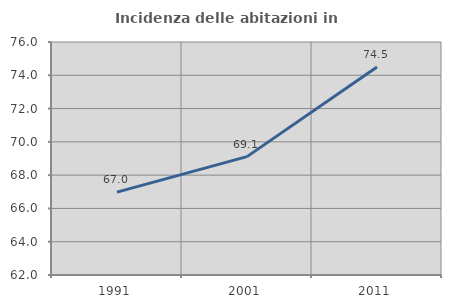
| Category | Incidenza delle abitazioni in proprietà  |
|---|---|
| 1991.0 | 66.979 |
| 2001.0 | 69.112 |
| 2011.0 | 74.504 |